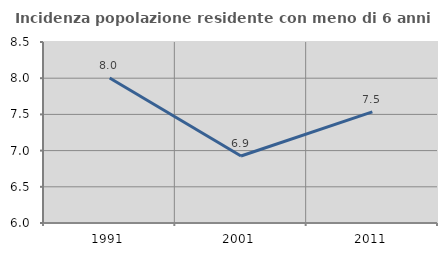
| Category | Incidenza popolazione residente con meno di 6 anni |
|---|---|
| 1991.0 | 8.004 |
| 2001.0 | 6.926 |
| 2011.0 | 7.535 |